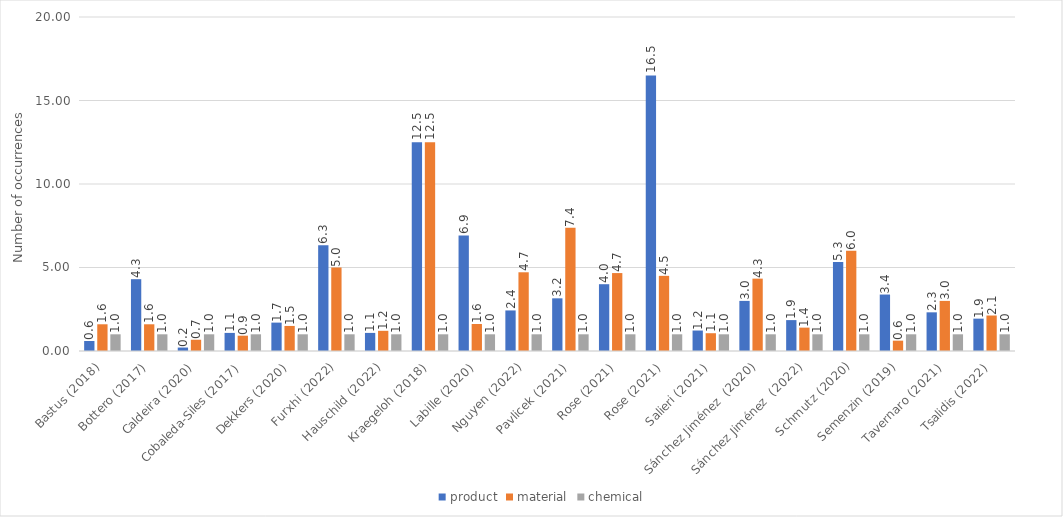
| Category | product | material | chemical |
|---|---|---|---|
| Bastus (2018) | 0.6 | 1.6 | 1 |
| Bottero (2017) | 4.3 | 1.6 | 1 |
| Caldeira (2020) | 0.207 | 0.674 | 1 |
| Cobaleda-Siles (2017) | 1.083 | 0.917 | 1 |
| Dekkers (2020) | 1.7 | 1.5 | 1 |
| Furxhi (2022) | 6.333 | 5 | 1 |
| Hauschild (2022) | 1.083 | 1.208 | 1 |
| Kraegeloh (2018) | 12.5 | 12.5 | 1 |
| Labille (2020) | 6.923 | 1.615 | 1 |
| Nguyen (2022) | 2.429 | 4.714 | 1 |
| Pavlicek (2021) | 3.154 | 7.385 | 1 |
| Rose (2021) | 4 | 4.667 | 1 |
| Rose (2021) | 16.5 | 4.5 | 1 |
| Salieri (2021) | 1.226 | 1.065 | 1 |
| Sánchez Jiménez  (2020) | 3 | 4.333 | 1 |
| Sánchez Jiménez  (2022) | 1.85 | 1.4 | 1 |
| Schmutz (2020) | 5.333 | 6 | 1 |
| Semenzin (2019) | 3.381 | 0.619 | 1 |
| Tavernaro (2021) | 2.316 | 3 | 1 |
| Tsalidis (2022) | 1.938 | 2.125 | 1 |